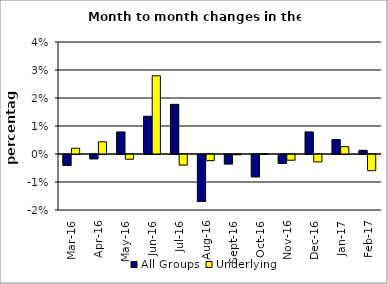
| Category | All Groups | Underlying |
|---|---|---|
| 2016-03-01 | -0.004 | 0.002 |
| 2016-04-01 | -0.002 | 0.004 |
| 2016-05-01 | 0.008 | -0.002 |
| 2016-06-01 | 0.013 | 0.028 |
| 2016-07-01 | 0.018 | -0.004 |
| 2016-08-01 | -0.017 | -0.002 |
| 2016-09-01 | -0.003 | 0 |
| 2016-10-01 | -0.008 | 0 |
| 2016-11-01 | -0.003 | -0.002 |
| 2016-12-01 | 0.008 | -0.003 |
| 2017-01-01 | 0.005 | 0.003 |
| 2017-02-01 | 0.001 | -0.006 |